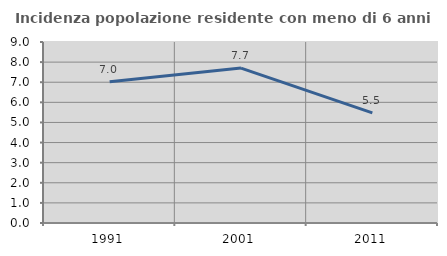
| Category | Incidenza popolazione residente con meno di 6 anni |
|---|---|
| 1991.0 | 7.021 |
| 2001.0 | 7.704 |
| 2011.0 | 5.474 |